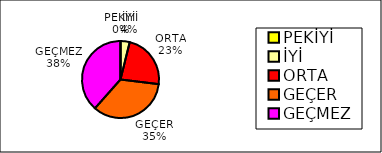
| Category | Series 0 |
|---|---|
| PEKİYİ | 0 |
| İYİ | 1 |
| ORTA | 6 |
| GEÇER | 9 |
| GEÇMEZ | 10 |